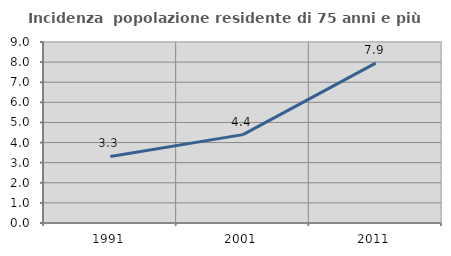
| Category | Incidenza  popolazione residente di 75 anni e più |
|---|---|
| 1991.0 | 3.311 |
| 2001.0 | 4.394 |
| 2011.0 | 7.949 |